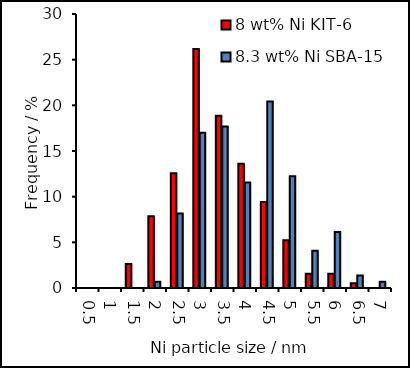
| Category | 8 wt% Ni KIT-6 | 8.3 wt% Ni SBA-15 |
|---|---|---|
| 0.5 | 0 | 0 |
| 1.0 | 0 | 0 |
| 1.5 | 2.618 | 0 |
| 2.0 | 7.853 | 0.68 |
| 2.5 | 12.565 | 8.163 |
| 3.0 | 26.178 | 17.007 |
| 3.5 | 18.848 | 17.687 |
| 4.0 | 13.613 | 11.565 |
| 4.5 | 9.424 | 20.408 |
| 5.0 | 5.236 | 12.245 |
| 5.5 | 1.571 | 4.082 |
| 6.0 | 1.571 | 6.122 |
| 6.5 | 0.524 | 1.361 |
| 7.0 | 0 | 0.68 |